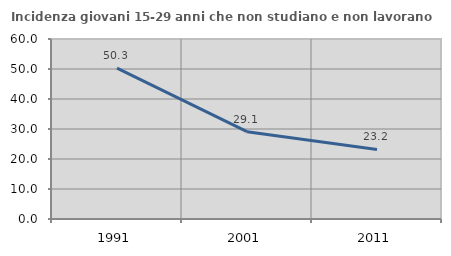
| Category | Incidenza giovani 15-29 anni che non studiano e non lavorano  |
|---|---|
| 1991.0 | 50.274 |
| 2001.0 | 29.099 |
| 2011.0 | 23.203 |